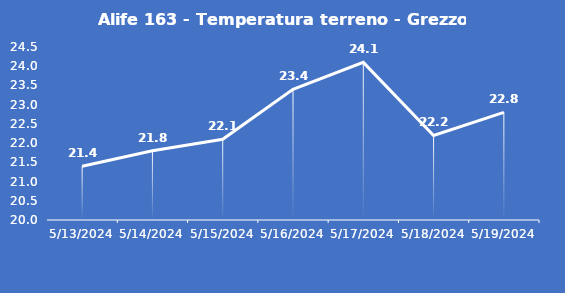
| Category | Alife 163 - Temperatura terreno - Grezzo (°C) |
|---|---|
| 5/13/24 | 21.4 |
| 5/14/24 | 21.8 |
| 5/15/24 | 22.1 |
| 5/16/24 | 23.4 |
| 5/17/24 | 24.1 |
| 5/18/24 | 22.2 |
| 5/19/24 | 22.8 |